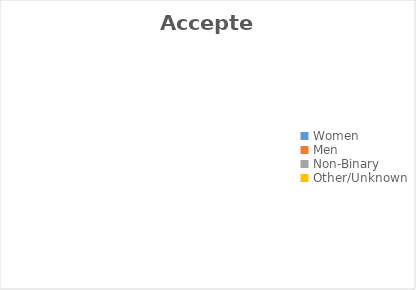
| Category | Accepted |
|---|---|
| Women | 0 |
| Men | 0 |
| Non-Binary | 0 |
| Other/Unknown | 0 |